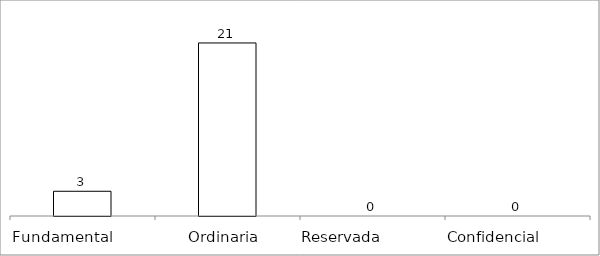
| Category | Series 0 |
|---|---|
| Fundamental         | 3 |
| Ordinaria  | 21 |
| Reservada               | 0 |
| Confidencial             | 0 |